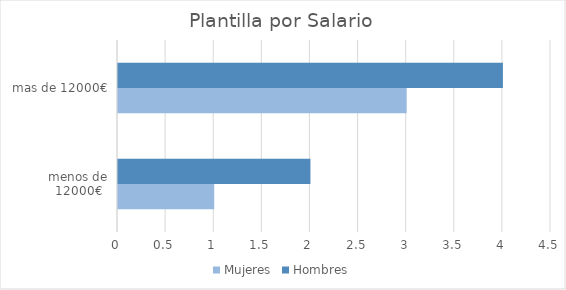
| Category | Mujeres | Hombres |
|---|---|---|
| menos de 12000€ | 1 | 2 |
| mas de 12000€ | 3 | 4 |